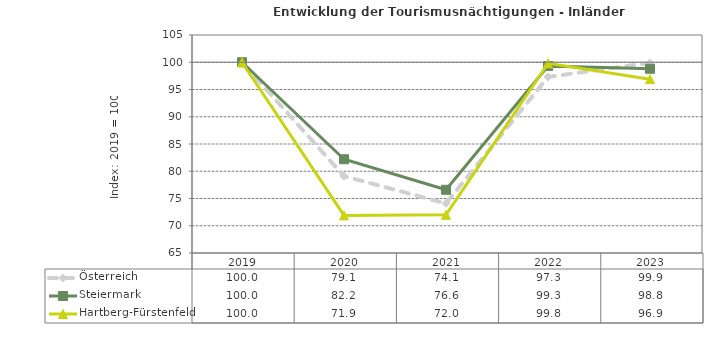
| Category | Österreich | Steiermark | Hartberg-Fürstenfeld |
|---|---|---|---|
| 2023.0 | 99.9 | 98.8 | 96.9 |
| 2022.0 | 97.3 | 99.3 | 99.8 |
| 2021.0 | 74.1 | 76.6 | 72 |
| 2020.0 | 79.1 | 82.2 | 71.9 |
| 2019.0 | 100 | 100 | 100 |